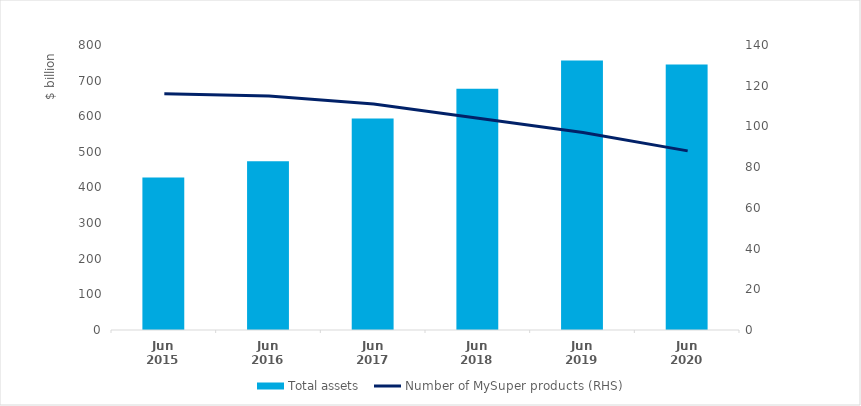
| Category | Total assets  |
|---|---|
| Jun 2015 | 428.2 |
| Jun 2016 | 473.7 |
| Jun 2017 | 593.5 |
| Jun 2018 | 677.4 |
| Jun 2019 | 756.4 |
| Jun 2020 | 745.2 |